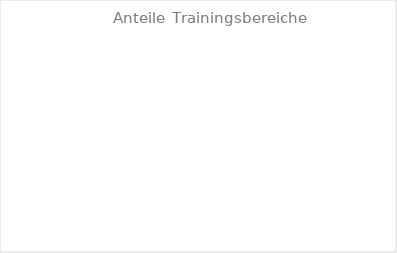
| Category | Series 0 |
|---|---|
| KB | 0 |
| G1 | 0 |
| G2 | 0 |
| EB | 0 |
| SB | 0 |
| K1/2 | 0 |
| K3 | 0 |
| WK | 0 |